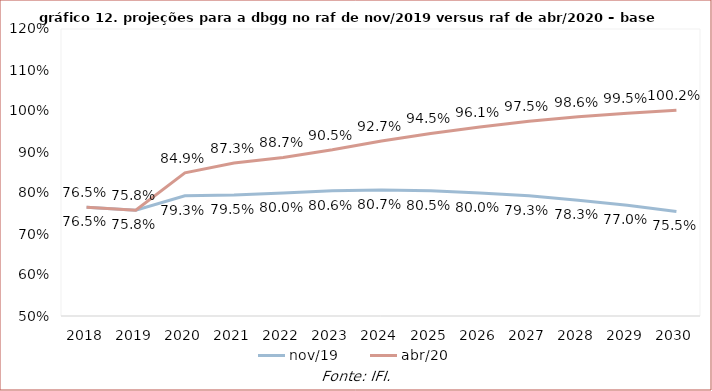
| Category | nov/19 | abr/20 |
|---|---|---|
| 2018.0 | 0.765 | 0.765 |
| 2019.0 | 0.758 | 0.758 |
| 2020.0 | 0.793 | 0.849 |
| 2021.0 | 0.795 | 0.873 |
| 2022.0 | 0.8 | 0.887 |
| 2023.0 | 0.806 | 0.905 |
| 2024.0 | 0.807 | 0.927 |
| 2025.0 | 0.805 | 0.945 |
| 2026.0 | 0.8 | 0.961 |
| 2027.0 | 0.793 | 0.975 |
| 2028.0 | 0.783 | 0.986 |
| 2029.0 | 0.77 | 0.995 |
| 2030.0 | 0.755 | 1.002 |